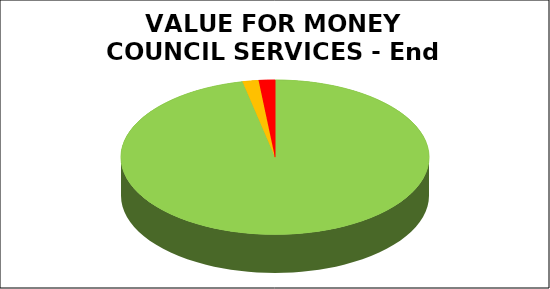
| Category | Series 0 |
|---|---|
| Green | 0.966 |
| Amber | 0.017 |
| Red | 0.017 |